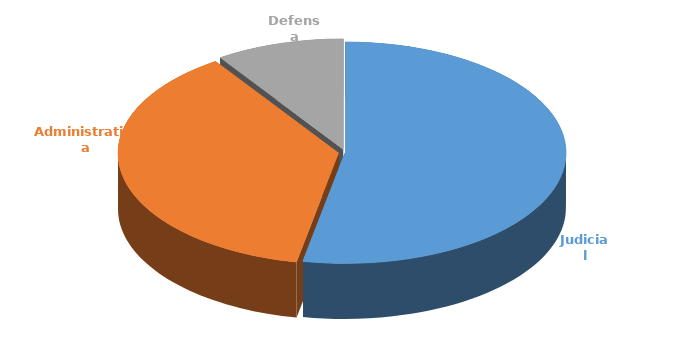
| Category | Cantidad |
|---|---|
| Judicial | 321 |
| Administrativa | 227 |
| Defensa | 57 |